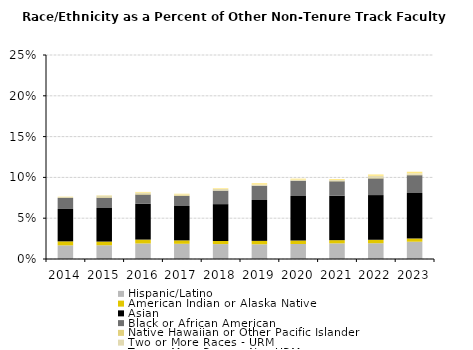
| Category | Hispanic/Latino | American Indian or Alaska Native | Asian  | Black or African American | Native Hawaiian or Other Pacific Islander | Two or More Races - URM | Two or More Races - Non-URM |
|---|---|---|---|---|---|---|---|
| 2014.0 | 0.017 | 0.005 | 0.04 | 0.013 | 0 | 0.001 | 0 |
| 2015.0 | 0.017 | 0.005 | 0.041 | 0.013 | 0.001 | 0.002 | 0 |
| 2016.0 | 0.019 | 0.005 | 0.044 | 0.011 | 0.001 | 0.002 | 0.001 |
| 2017.0 | 0.019 | 0.004 | 0.042 | 0.012 | 0.001 | 0.001 | 0.001 |
| 2018.0 | 0.018 | 0.004 | 0.045 | 0.017 | 0 | 0.002 | 0.001 |
| 2019.0 | 0.018 | 0.004 | 0.05 | 0.017 | 0 | 0.001 | 0.002 |
| 2020.0 | 0.018 | 0.004 | 0.055 | 0.019 | 0 | 0.001 | 0.001 |
| 2021.0 | 0.019 | 0.004 | 0.054 | 0.018 | 0.001 | 0.001 | 0.001 |
| 2022.0 | 0.019 | 0.004 | 0.055 | 0.02 | 0.001 | 0.003 | 0.002 |
| 2023.0 | 0.021 | 0.004 | 0.056 | 0.022 | 0.001 | 0.001 | 0.002 |